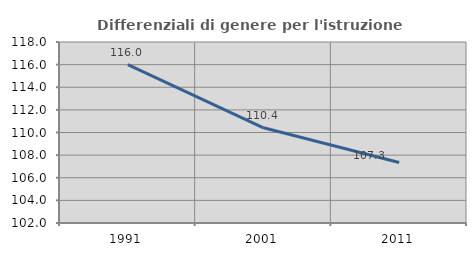
| Category | Differenziali di genere per l'istruzione superiore |
|---|---|
| 1991.0 | 116.008 |
| 2001.0 | 110.415 |
| 2011.0 | 107.341 |